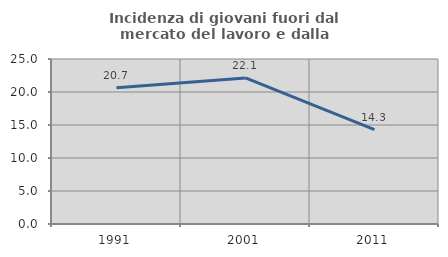
| Category | Incidenza di giovani fuori dal mercato del lavoro e dalla formazione  |
|---|---|
| 1991.0 | 20.655 |
| 2001.0 | 22.129 |
| 2011.0 | 14.286 |